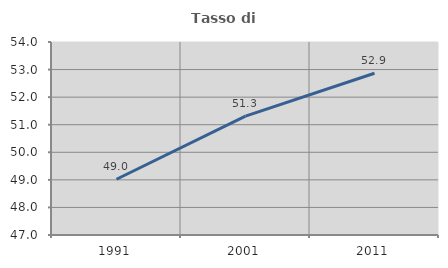
| Category | Tasso di occupazione   |
|---|---|
| 1991.0 | 49.022 |
| 2001.0 | 51.31 |
| 2011.0 | 52.868 |